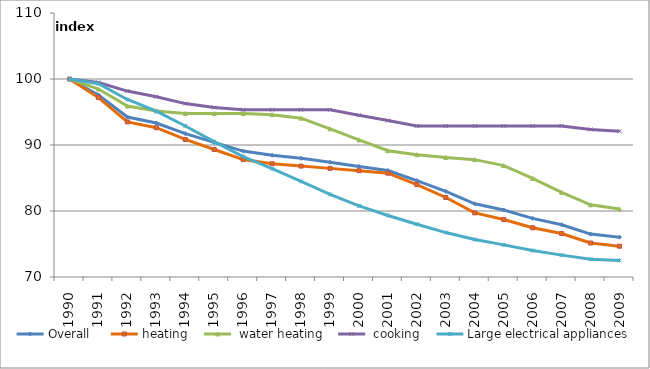
| Category | Overall  | heating |  water heating |  cooking | Large electrical appliances |
|---|---|---|---|---|---|
| 1990.0 | 100 | 100 | 100 | 100 | 100 |
| 1991.0 | 97.59 | 97.183 | 98.479 | 99.473 | 99.281 |
| 1992.0 | 94.237 | 93.495 | 95.899 | 98.17 | 96.899 |
| 1993.0 | 93.326 | 92.623 | 95.168 | 97.323 | 95.117 |
| 1994.0 | 91.73 | 90.84 | 94.767 | 96.275 | 92.873 |
| 1995.0 | 90.399 | 89.319 | 94.767 | 95.692 | 90.517 |
| 1996.0 | 89.075 | 87.791 | 94.767 | 95.335 | 88.253 |
| 1997.0 | 88.459 | 87.17 | 94.592 | 95.335 | 86.404 |
| 1998.0 | 87.988 | 86.808 | 94.068 | 95.335 | 84.483 |
| 1999.0 | 87.385 | 86.459 | 92.446 | 95.335 | 82.521 |
| 2000.0 | 86.755 | 86.107 | 90.776 | 94.519 | 80.768 |
| 2001.0 | 86.131 | 85.732 | 89.142 | 93.703 | 79.319 |
| 2002.0 | 84.605 | 83.999 | 88.516 | 92.886 | 77.993 |
| 2003.0 | 82.977 | 82.045 | 88.113 | 92.886 | 76.732 |
| 2004.0 | 81.087 | 79.718 | 87.782 | 92.886 | 75.67 |
| 2005.0 | 80.152 | 78.716 | 86.877 | 92.886 | 74.868 |
| 2006.0 | 78.884 | 77.456 | 84.936 | 92.886 | 74.007 |
| 2007.0 | 77.906 | 76.589 | 82.824 | 92.886 | 73.312 |
| 2008.0 | 76.502 | 75.148 | 80.939 | 92.352 | 72.696 |
| 2009.0 | 76.03 | 74.664 | 80.308 | 92.085 | 72.519 |